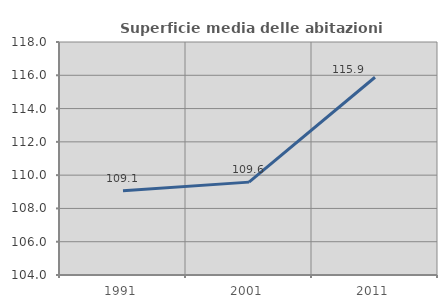
| Category | Superficie media delle abitazioni occupate |
|---|---|
| 1991.0 | 109.057 |
| 2001.0 | 109.58 |
| 2011.0 | 115.883 |